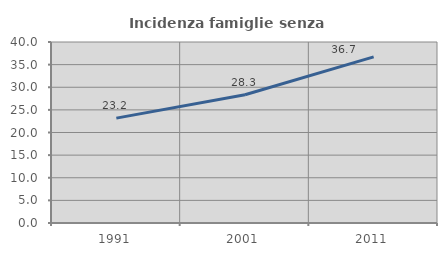
| Category | Incidenza famiglie senza nuclei |
|---|---|
| 1991.0 | 23.181 |
| 2001.0 | 28.333 |
| 2011.0 | 36.719 |